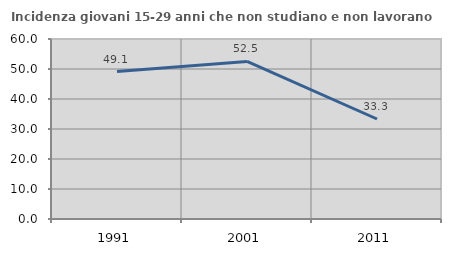
| Category | Incidenza giovani 15-29 anni che non studiano e non lavorano  |
|---|---|
| 1991.0 | 49.129 |
| 2001.0 | 52.53 |
| 2011.0 | 33.333 |